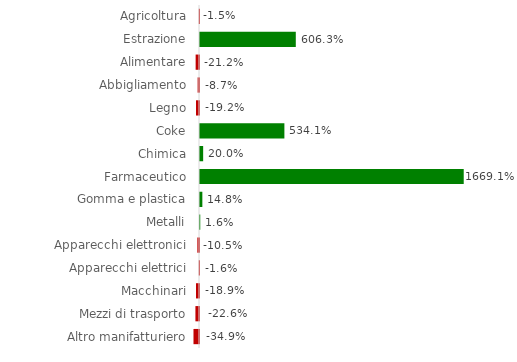
| Category | Series 0 |
|---|---|
| Agricoltura | -0.015 |
| Estrazione | 6.063 |
| Alimentare | -0.212 |
| Abbigliamento | -0.087 |
| Legno | -0.192 |
| Coke | 5.341 |
| Chimica | 0.2 |
| Farmaceutico | 16.691 |
| Gomma e plastica | 0.148 |
| Metalli | 0.016 |
| Apparecchi elettronici | -0.105 |
| Apparecchi elettrici | -0.016 |
| Macchinari | -0.189 |
| Mezzi di trasporto | -0.226 |
| Altro manifatturiero | -0.349 |